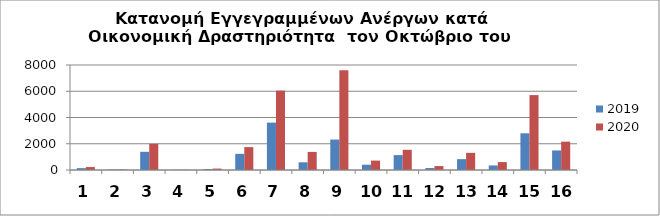
| Category | 2019 | 2020 |
|---|---|---|
| 0 | 142 | 225 |
| 1 | 35 | 41 |
| 2 | 1385 | 1991 |
| 3 | 11 | 15 |
| 4 | 76 | 108 |
| 5 | 1229 | 1743 |
| 6 | 3610 | 6051 |
| 7 | 588 | 1379 |
| 8 | 2319 | 7602 |
| 9 | 404 | 717 |
| 10 | 1135 | 1540 |
| 11 | 150 | 299 |
| 12 | 826 | 1307 |
| 13 | 347 | 603 |
| 14 | 2796 | 5706 |
| 15 | 1491 | 2160 |